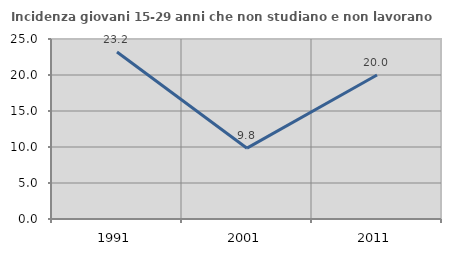
| Category | Incidenza giovani 15-29 anni che non studiano e non lavorano  |
|---|---|
| 1991.0 | 23.188 |
| 2001.0 | 9.836 |
| 2011.0 | 20 |